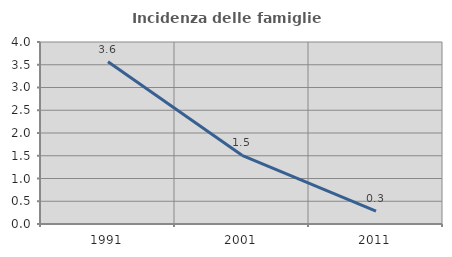
| Category | Incidenza delle famiglie numerose |
|---|---|
| 1991.0 | 3.567 |
| 2001.0 | 1.51 |
| 2011.0 | 0.284 |